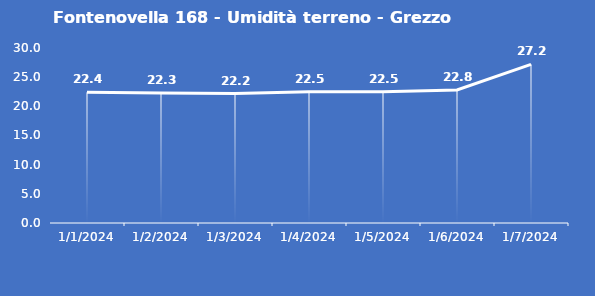
| Category | Fontenovella 168 - Umidità terreno - Grezzo (%VWC) |
|---|---|
| 1/1/24 | 22.4 |
| 1/2/24 | 22.3 |
| 1/3/24 | 22.2 |
| 1/4/24 | 22.5 |
| 1/5/24 | 22.5 |
| 1/6/24 | 22.8 |
| 1/7/24 | 27.2 |